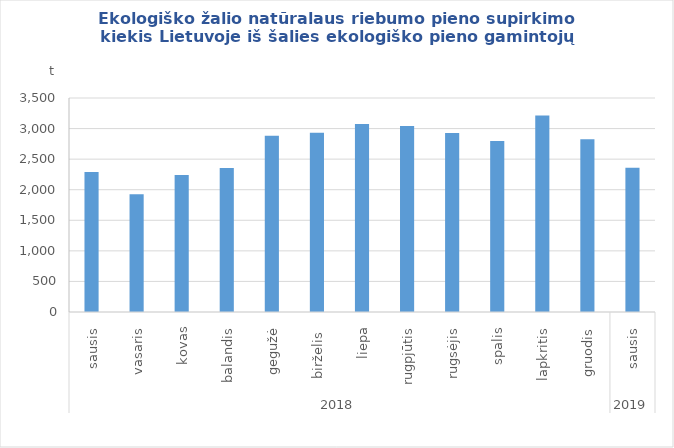
| Category | Ekologiško žalio natūralaus riebumo pieno supirkimo kiekis Lietuvoje iš šalies ekologiško pieno gamintojų |
|---|---|
| 0 | 2289.96 |
| 1 | 1924.79 |
| 2 | 2239.04 |
| 3 | 2355.85 |
| 4 | 2880.68 |
| 5 | 2932.94 |
| 6 | 3072.75 |
| 7 | 3043.77 |
| 8 | 2927.63 |
| 9 | 2797.26 |
| 10 | 3213.87 |
| 11 | 2826.94 |
| 12 | 2357.31 |